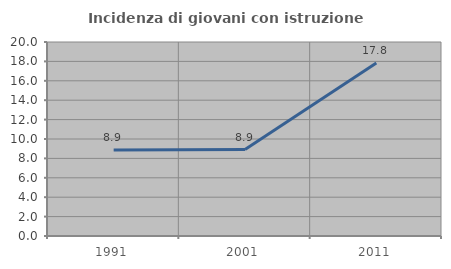
| Category | Incidenza di giovani con istruzione universitaria |
|---|---|
| 1991.0 | 8.861 |
| 2001.0 | 8.915 |
| 2011.0 | 17.826 |